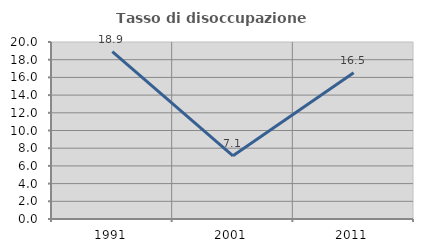
| Category | Tasso di disoccupazione giovanile  |
|---|---|
| 1991.0 | 18.91 |
| 2001.0 | 7.143 |
| 2011.0 | 16.535 |